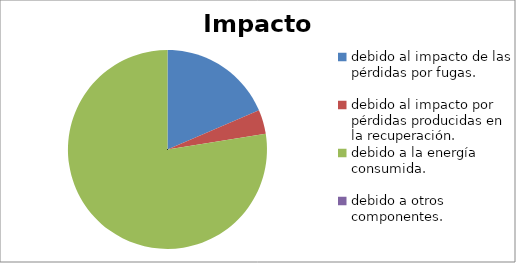
| Category | Impacto TEWI |
|---|---|
| debido al impacto de las pérdidas por fugas. | 0.186 |
| debido al impacto por pérdidas producidas en la recuperación. | 0.039 |
| debido a la energía consumida. | 0.776 |
| debido a otros componentes. | 0 |